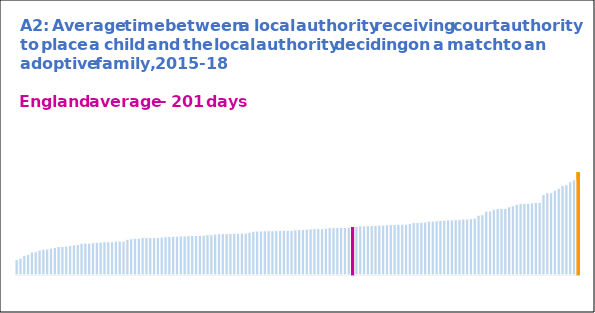
| Category | 0 | N/A |
|---|---|---|
| 0 | 0 | 63 |
| 1 | 0 | 69 |
| 2 | 0 | 80 |
| 3 | 0 | 85 |
| 4 | 0 | 95 |
| 5 | 0 | 96 |
| 6 | 0 | 103 |
| 7 | 0 | 107 |
| 8 | 0 | 108 |
| 9 | 0 | 111 |
| 10 | 0 | 114 |
| 11 | 0 | 118 |
| 12 | 0 | 118 |
| 13 | 0 | 120 |
| 14 | 0 | 123 |
| 15 | 0 | 125 |
| 16 | 0 | 127 |
| 17 | 0 | 132 |
| 18 | 0 | 133 |
| 19 | 0 | 133 |
| 20 | 0 | 135 |
| 21 | 0 | 136 |
| 22 | 0 | 137 |
| 23 | 0 | 138 |
| 24 | 0 | 138 |
| 25 | 0 | 138 |
| 26 | 0 | 141 |
| 27 | 0 | 141 |
| 28 | 0 | 141 |
| 29 | 0 | 149 |
| 30 | 0 | 151 |
| 31 | 0 | 153 |
| 32 | 0 | 153 |
| 33 | 0 | 156 |
| 34 | 0 | 156 |
| 35 | 0 | 156 |
| 36 | 0 | 156 |
| 37 | 0 | 157 |
| 38 | 0 | 158 |
| 39 | 0 | 160 |
| 40 | 0 | 161 |
| 41 | 0 | 162 |
| 42 | 0 | 162 |
| 43 | 0 | 163 |
| 44 | 0 | 163 |
| 45 | 0 | 164 |
| 46 | 0 | 165 |
| 47 | 0 | 165 |
| 48 | 0 | 166 |
| 49 | 0 | 166 |
| 50 | 0 | 168 |
| 51 | 0 | 168 |
| 52 | 0 | 171 |
| 53 | 0 | 172 |
| 54 | 0 | 173 |
| 55 | 0 | 173 |
| 56 | 0 | 173 |
| 57 | 0 | 174 |
| 58 | 0 | 174 |
| 59 | 0 | 175 |
| 60 | 0 | 175 |
| 61 | 0 | 179 |
| 62 | 0 | 183 |
| 63 | 0 | 184 |
| 64 | 0 | 184 |
| 65 | 0 | 185 |
| 66 | 0 | 185 |
| 67 | 0 | 185 |
| 68 | 0 | 186 |
| 69 | 0 | 187 |
| 70 | 0 | 187 |
| 71 | 0 | 187 |
| 72 | 0 | 187 |
| 73 | 0 | 189 |
| 74 | 0 | 190 |
| 75 | 0 | 191 |
| 76 | 0 | 192 |
| 77 | 0 | 193 |
| 78 | 0 | 194 |
| 79 | 0 | 194 |
| 80 | 0 | 194 |
| 81 | 0 | 196 |
| 82 | 0 | 198 |
| 83 | 0 | 198 |
| 84 | 0 | 199 |
| 85 | 0 | 199 |
| 86 | 0 | 199 |
| 87 | 0 | 200 |
| 88 | 0 | 0 |
| 89 | 0 | 203 |
| 90 | 0 | 206 |
| 91 | 0 | 206 |
| 92 | 0 | 207 |
| 93 | 0 | 207 |
| 94 | 0 | 208 |
| 95 | 0 | 209 |
| 96 | 0 | 209 |
| 97 | 0 | 210 |
| 98 | 0 | 211 |
| 99 | 0 | 212 |
| 100 | 0 | 213 |
| 101 | 0 | 213 |
| 102 | 0 | 213 |
| 103 | 0 | 216 |
| 104 | 0 | 220 |
| 105 | 0 | 220 |
| 106 | 0 | 221 |
| 107 | 0 | 222 |
| 108 | 0 | 226 |
| 109 | 0 | 226 |
| 110 | 0 | 227 |
| 111 | 0 | 229 |
| 112 | 0 | 230 |
| 113 | 0 | 231 |
| 114 | 0 | 231 |
| 115 | 0 | 232 |
| 116 | 0 | 232 |
| 117 | 0 | 235 |
| 118 | 0 | 235 |
| 119 | 0 | 236 |
| 120 | 0 | 238 |
| 121 | 0 | 251 |
| 122 | 0 | 253 |
| 123 | 0 | 268 |
| 124 | 0 | 269 |
| 125 | 0 | 276 |
| 126 | 0 | 279 |
| 127 | 0 | 280 |
| 128 | 0 | 280 |
| 129 | 0 | 287 |
| 130 | 0 | 291 |
| 131 | 0 | 297 |
| 132 | 0 | 300 |
| 133 | 0 | 301 |
| 134 | 0 | 302 |
| 135 | 0 | 303 |
| 136 | 0 | 305 |
| 137 | 0 | 305 |
| 138 | 0 | 339 |
| 139 | 0 | 346 |
| 140 | 0 | 346 |
| 141 | 0 | 357 |
| 142 | 0 | 365 |
| 143 | 0 | 377 |
| 144 | 0 | 380 |
| 145 | 0 | 393 |
| 146 | 0 | 401 |
| 147 | 434 | 0 |